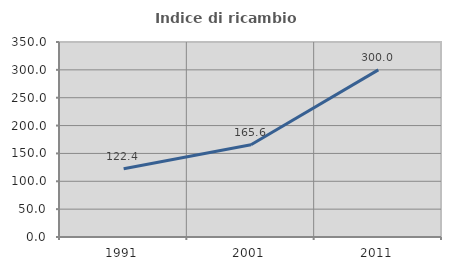
| Category | Indice di ricambio occupazionale  |
|---|---|
| 1991.0 | 122.353 |
| 2001.0 | 165.591 |
| 2011.0 | 300 |